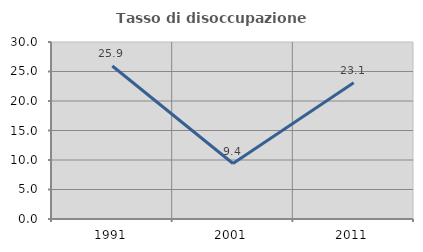
| Category | Tasso di disoccupazione giovanile  |
|---|---|
| 1991.0 | 25.926 |
| 2001.0 | 9.402 |
| 2011.0 | 23.077 |